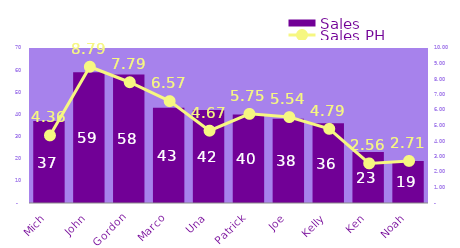
| Category | Sales |
|---|---|
| Mich | 37 |
| John | 59 |
| Gordon | 58 |
| Marco | 43 |
| Una | 42 |
| Patrick | 40 |
| Joe | 38 |
| Kelly | 36 |
| Ken | 23 |
| Noah | 19 |